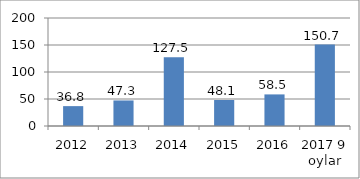
| Category | Series 0 |
|---|---|
| 2012 | 36.8 |
| 2013 | 47.3 |
| 2014 | 127.5 |
| 2015 | 48.1 |
| 2016 | 58.5 |
| 2017 9 oylar | 150.7 |